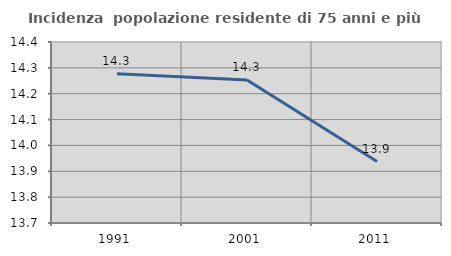
| Category | Incidenza  popolazione residente di 75 anni e più |
|---|---|
| 1991.0 | 14.277 |
| 2001.0 | 14.253 |
| 2011.0 | 13.938 |